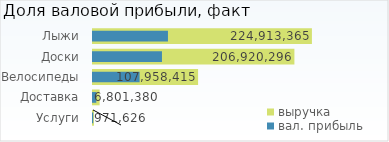
| Category | выручка |
|---|---|
| Услуги | 971625.738 |
| Доставка | 6801380.167 |
| Велосипеды | 107958415.352 |
| Доски | 206920296.091 |
| Лыжи | 224913365.316 |